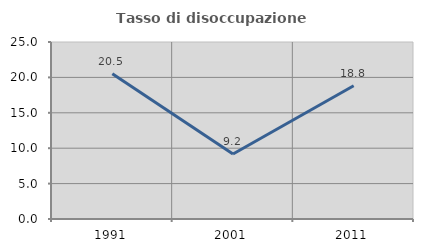
| Category | Tasso di disoccupazione giovanile  |
|---|---|
| 1991.0 | 20.53 |
| 2001.0 | 9.174 |
| 2011.0 | 18.812 |